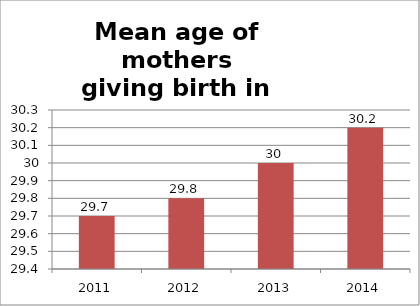
| Category | Series 1 |
|---|---|
| 2011 | 29.7 |
| 2012 | 29.8 |
| 2013 | 30 |
| 2014 | 30.2 |